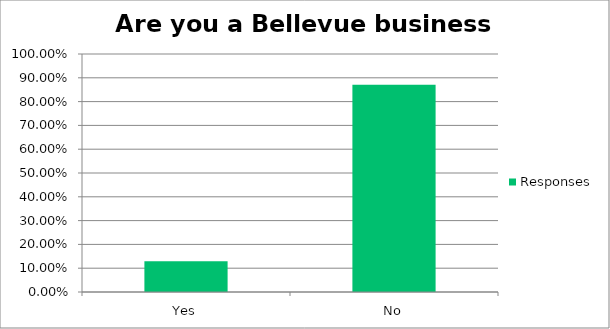
| Category | Responses |
|---|---|
| Yes | 0.129 |
| No | 0.871 |